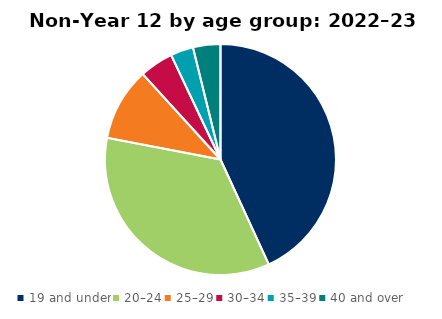
| Category | Series 0 |
|---|---|
| 19 and under | 7566 |
| 20–24 | 6118 |
| 25–29 | 1796 |
| 30–34 | 828 |
| 35–39 | 561 |
| 40 and over | 673 |